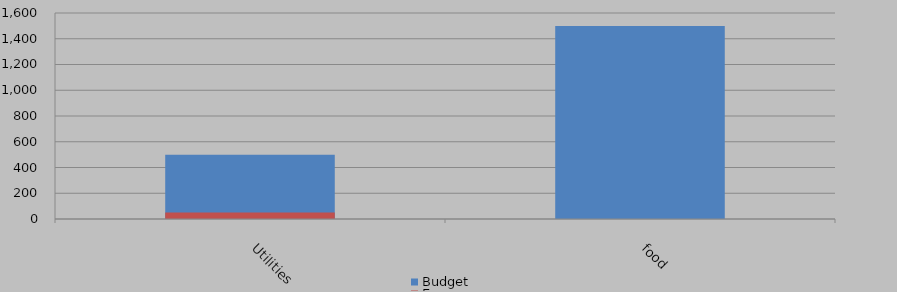
| Category | Budget | Expense |
|---|---|---|
| food | 1500 | 0 |
| Utilities | 500 | 50 |